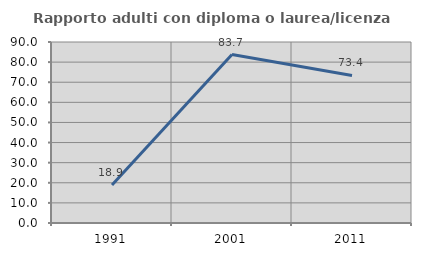
| Category | Rapporto adulti con diploma o laurea/licenza media  |
|---|---|
| 1991.0 | 18.897 |
| 2001.0 | 83.742 |
| 2011.0 | 73.378 |